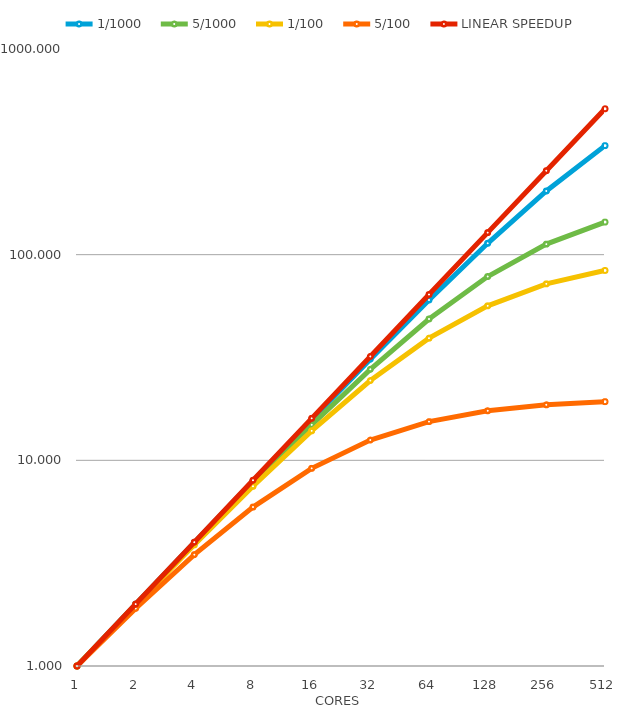
| Category | 1/1000
 | 5/1000
 | 1/100
 | 5/100
 | LINEAR SPEEDUP
 |
|---|---|---|---|---|---|
| 1 | 1 | 1 | 1 | 1 | 1 |
| 2 | 1.998 | 1.99 | 1.98 | 1.905 | 2 |
| 4 | 3.988 | 3.941 | 3.883 | 3.478 | 4 |
| 8 | 7.944 | 7.729 | 7.477 | 5.926 | 8 |
| 16 | 15.764 | 14.884 | 13.913 | 9.143 | 16 |
| 32 | 31.038 | 27.706 | 24.427 | 12.549 | 32 |
| 64 | 60.207 | 48.669 | 39.264 | 15.422 | 64 |
| 128 | 113.576 | 78.287 | 56.388 | 17.415 | 128 |
| 256 | 203.984 | 112.527 | 72.113 | 18.618 | 256 |
| 512 | 338.848 | 144.023 | 83.797 | 19.284 | 512 |